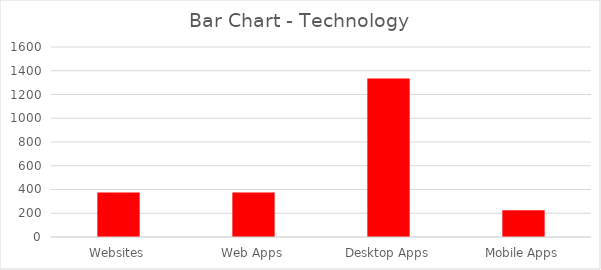
| Category | Series 0 |
|---|---|
| Websites | 375 |
| Web Apps | 375 |
| Desktop Apps | 1335 |
| Mobile Apps | 225 |